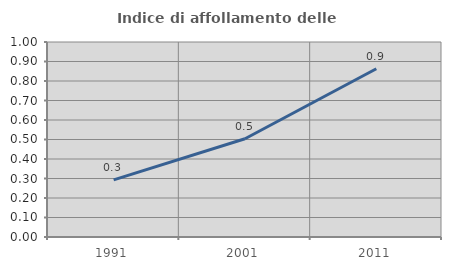
| Category | Indice di affollamento delle abitazioni  |
|---|---|
| 1991.0 | 0.293 |
| 2001.0 | 0.504 |
| 2011.0 | 0.863 |